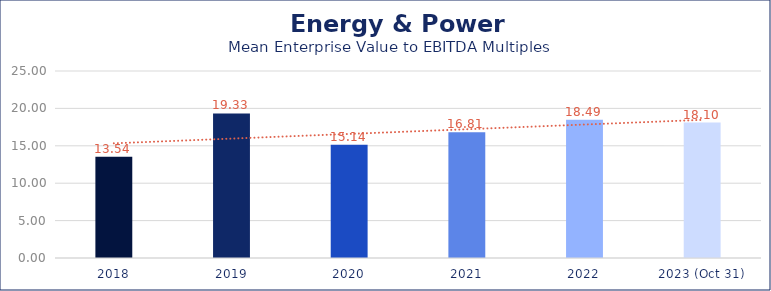
| Category | Energy & Power |
|---|---|
| 2018 | 13.54 |
| 2019 | 19.33 |
| 2020 | 15.14 |
| 2021 | 16.81 |
| 2022 | 18.49 |
| 2023 (Oct 31) | 18.1 |